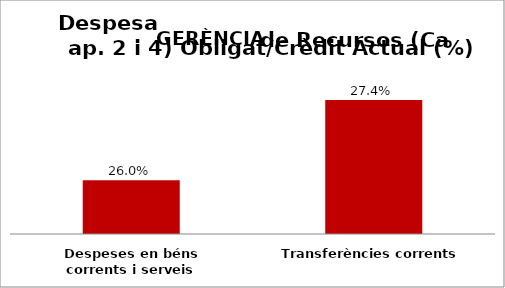
| Category | Series 0 |
|---|---|
| Despeses en béns corrents i serveis | 0.26 |
| Transferències corrents | 0.274 |